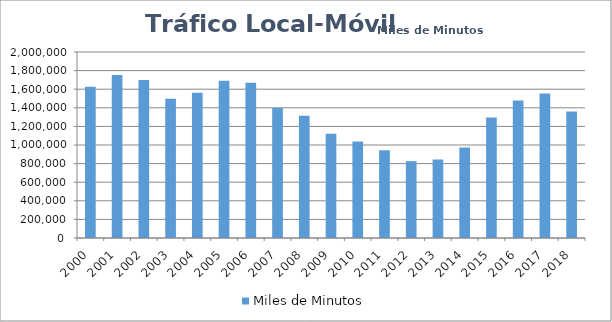
| Category | Miles de Minutos |
|---|---|
| 2000 | 1627028 |
| 2001 | 1752982 |
| 2002 | 1700120 |
| 2003 | 1497591 |
| 2004 | 1562293 |
| 2005 | 1690428 |
| 2006 | 1668463.423 |
| 2007 | 1397811.019 |
| 2008 | 1314507.034 |
| 2009 | 1120321.35 |
| 2010 | 1037043.938 |
| 2011 | 944322.029 |
| 2012 | 826511.145 |
| 2013 | 844044.583 |
| 2014 | 973602.636 |
| 2015 | 1296335.952 |
| 2016 | 1477242.661 |
| 2017 | 1554908.525 |
| 2018 | 1360059.612 |